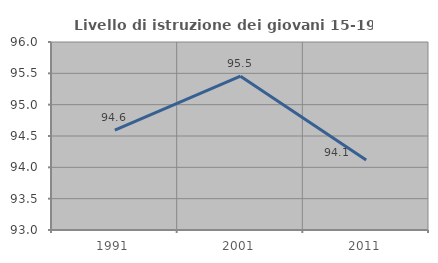
| Category | Livello di istruzione dei giovani 15-19 anni |
|---|---|
| 1991.0 | 94.595 |
| 2001.0 | 95.455 |
| 2011.0 | 94.118 |